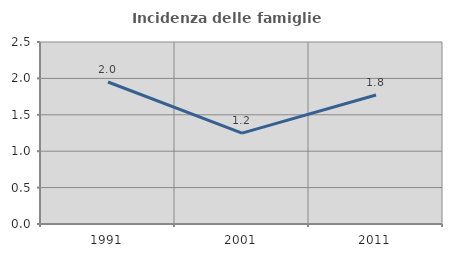
| Category | Incidenza delle famiglie numerose |
|---|---|
| 1991.0 | 1.95 |
| 2001.0 | 1.248 |
| 2011.0 | 1.773 |